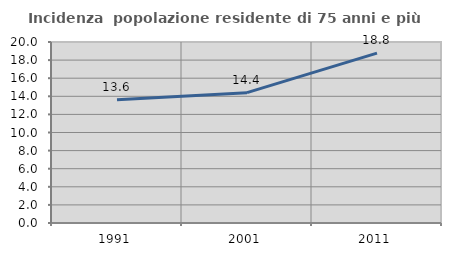
| Category | Incidenza  popolazione residente di 75 anni e più |
|---|---|
| 1991.0 | 13.624 |
| 2001.0 | 14.405 |
| 2011.0 | 18.773 |